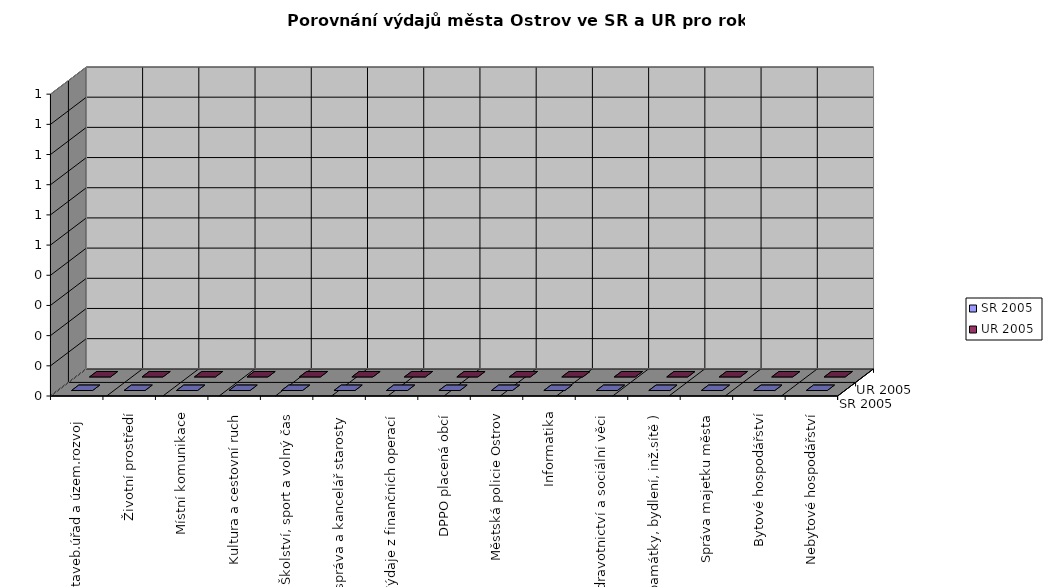
| Category | SR 2005 | UR 2005 |
|---|---|---|
| Staveb.úřad a územ.rozvoj  | 0 | 0 |
| Životní prostředí | 0 | 0 |
| Místní komunikace | 0 | 0 |
| Kultura a cestovní ruch | 0 | 0 |
| Školství, sport a volný čas | 0 | 0 |
| Vnitřní správa a kancelář starosty | 0 | 0 |
| Výdaje z finančních operací | 0 | 0 |
| DPPO placená obcí | 0 | 0 |
| Městská policie Ostrov | 0 | 0 |
| Informatika | 0 | 0 |
| Zdravotnictví a sociální věci | 0 | 0 |
| Investice (památky, bydlení, inž.sítě ) | 0 | 0 |
| Správa majetku města | 0 | 0 |
| Bytové hospodářství | 0 | 0 |
| Nebytové hospodářství | 0 | 0 |